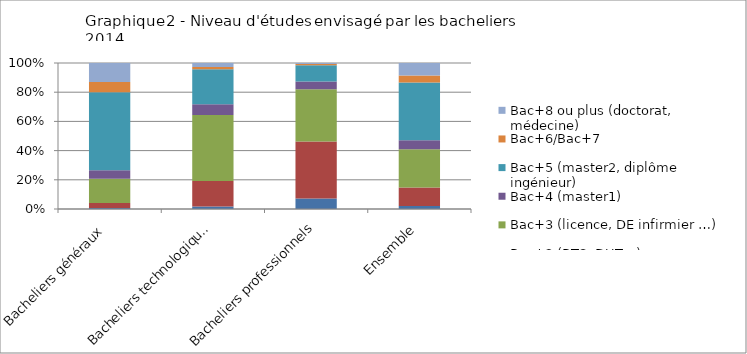
| Category | Bac/Bac+1 | Bac+2 (BTS, DUT…) | Bac+3 (licence, DE infirmier …) | Bac+4 (master1) | Bac+5 (master2, diplôme ingénieur) | Bac+6/Bac+7 | Bac+8 ou plus (doctorat, médecine) |
|---|---|---|---|---|---|---|---|
| Bacheliers généraux | 0.7 | 3.4 | 16.7 | 5.8 | 53.3 | 7.1 | 13 |
| Bacheliers technologiques | 1.7 | 17.5 | 45.2 | 7.4 | 24 | 1.5 | 2.7 |
| Bacheliers professionnels | 7.2 | 39.1 | 35.7 | 5.4 | 11.1 | 0.8 | 0.7 |
| Ensemble | 2.1 | 12.7 | 26.2 | 6.1 | 39.5 | 4.8 | 8.6 |